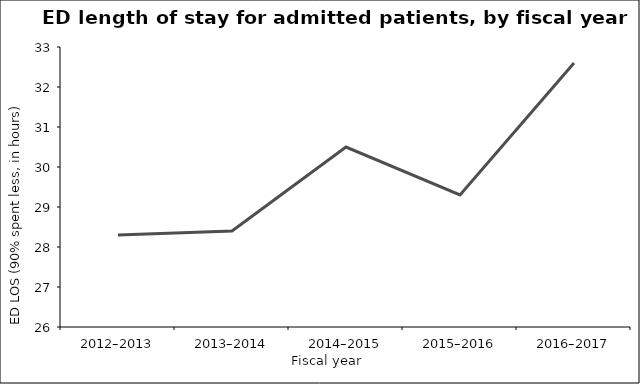
| Category | Series 0 |
|---|---|
| 2012–2013 | 28.3 |
| 2013–2014 | 28.4 |
| 2014–2015 | 30.5 |
| 2015–2016 | 29.3 |
| 2016–2017 | 32.6 |